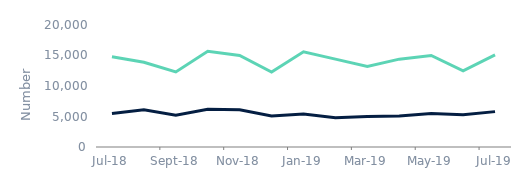
| Category | House purchase | Remortgage |
|---|---|---|
| 2018-07-01 | 5500 | 14800 |
| 2018-08-01 | 6100 | 13900 |
| 2018-09-01 | 5200 | 12300 |
| 2018-10-01 | 6200 | 15700 |
| 2018-11-01 | 6100 | 15000 |
| 2018-12-01 | 5100 | 12300 |
| 2019-01-01 | 5400 | 15600 |
| 2019-02-01 | 4800 | 14400 |
| 2019-03-01 | 5000 | 13200 |
| 2019-04-01 | 5100 | 14400 |
| 2019-05-01 | 5500 | 15000 |
| 2019-06-01 | 5300 | 12500 |
| 2019-07-01 | 5800 | 15100 |